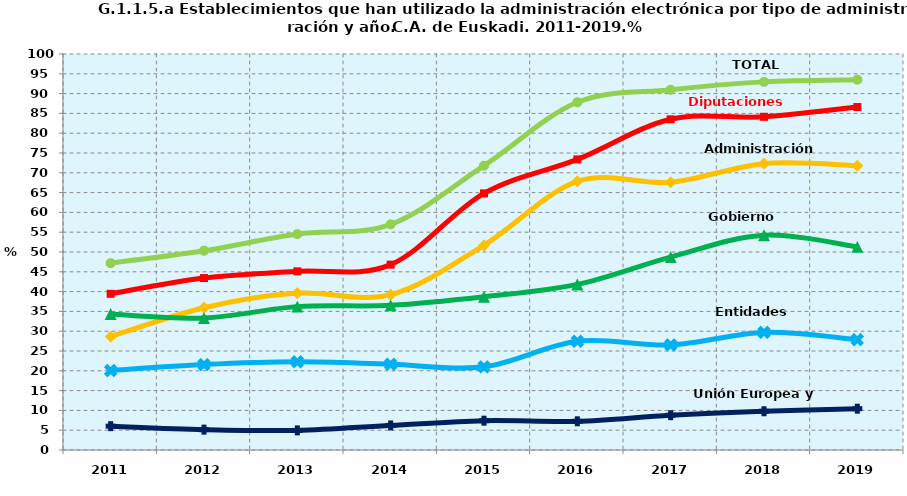
| Category | TOTAL | Diputaciones Forales | Administración Central | Gobierno Vasco | Entidades Locales | Unión Europea y Otros |
|---|---|---|---|---|---|---|
| 2011.0 | 47.195 | 39.446 | 28.619 | 34.347 | 20.063 | 6.017 |
| 2012.0 | 50.321 | 43.417 | 35.926 | 33.339 | 21.568 | 5.144 |
| 2013.0 | 54.524 | 45.118 | 39.622 | 36.207 | 22.264 | 4.948 |
| 2014.0 | 56.986 | 46.807 | 39.221 | 36.539 | 21.658 | 6.198 |
| 2015.0 | 71.8 | 64.8 | 51.7 | 38.7 | 21 | 7.4 |
| 2016.0 | 87.813 | 73.385 | 67.853 | 41.82 | 27.461 | 7.249 |
| 2017.0 | 90.959 | 83.514 | 67.612 | 48.718 | 26.543 | 8.784 |
| 2018.0 | 92.961 | 84.142 | 72.311 | 54.229 | 29.694 | 9.782 |
| 2019.0 | 93.517 | 86.609 | 71.787 | 51.305 | 27.87 | 10.432 |